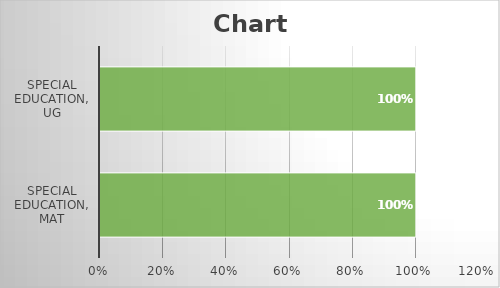
| Category | Series 0 | Series 1 | Series 2 | Series 3 | Series 4 | Series 5 |
|---|---|---|---|---|---|---|
| Special Education, MAT |  |  |  |  |  | 1 |
| Special Education, UG |  |  |  |  |  | 1 |